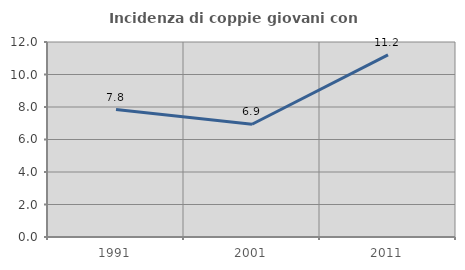
| Category | Incidenza di coppie giovani con figli |
|---|---|
| 1991.0 | 7.843 |
| 2001.0 | 6.939 |
| 2011.0 | 11.211 |